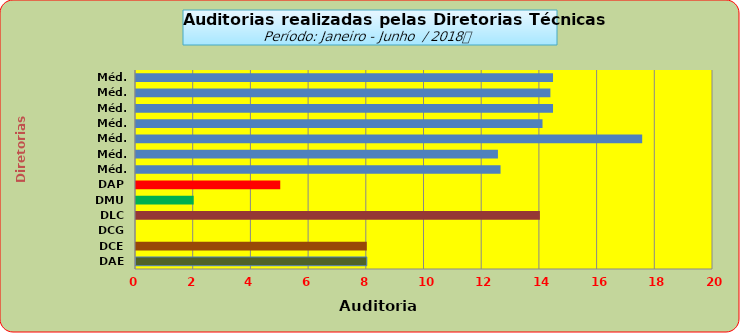
| Category | Series 0 |
|---|---|
| DAE | 8 |
| DCE | 8 |
| DCG | 0 |
| DLC | 14 |
| DMU | 2 |
| DAP | 5 |
| Méd. 2011 | 12.636 |
| Méd. 2012 | 12.545 |
| Méd. 2013 | 17.545 |
| Méd. 2014 | 14.091 |
| Méd. 2015 | 14.455 |
| Méd. 2016 | 14.364 |
| Méd. 2017 | 14.455 |